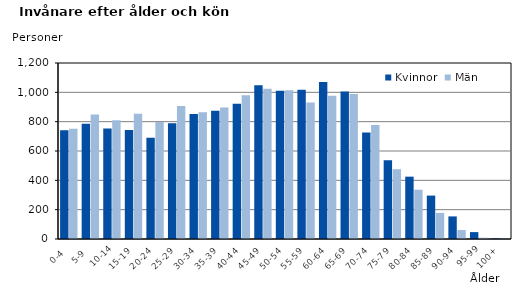
| Category | Kvinnor | Män |
|---|---|---|
|   0-4  | 742 | 752 |
|   5-9  | 786 | 849 |
| 10-14 | 753 | 809 |
| 15-19  | 744 | 854 |
| 20-24  | 690 | 798 |
| 25-29  | 790 | 907 |
| 30-34  | 853 | 865 |
| 35-39  | 875 | 896 |
| 40-44  | 923 | 980 |
| 45-49  | 1049 | 1025 |
| 50-54  | 1011 | 1015 |
| 55-59  | 1017 | 930 |
| 60-64  | 1070 | 977 |
| 65-69  | 1006 | 989 |
| 70-74  | 726 | 778 |
| 75-79  | 537 | 476 |
| 80-84  | 425 | 336 |
| 85-89  | 296 | 178 |
| 90-94  | 154 | 61 |
| 95-99 | 47 | 9 |
| 100+ | 4 | 1 |